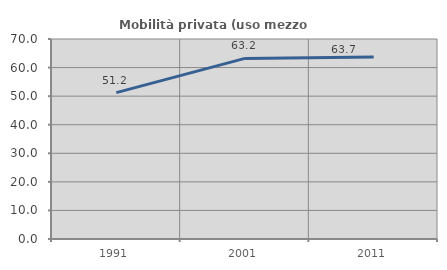
| Category | Mobilità privata (uso mezzo privato) |
|---|---|
| 1991.0 | 51.243 |
| 2001.0 | 63.21 |
| 2011.0 | 63.712 |